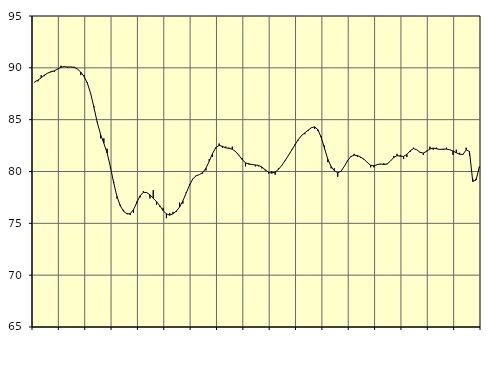
| Category | Piggar | Series 1 |
|---|---|---|
| nan | 88.6 | 88.65 |
| 87.0 | 88.7 | 88.81 |
| 87.0 | 89.3 | 89.04 |
| 87.0 | 89.2 | 89.31 |
| nan | 89.5 | 89.5 |
| 88.0 | 89.7 | 89.62 |
| 88.0 | 89.6 | 89.72 |
| 88.0 | 89.9 | 89.88 |
| nan | 90.2 | 90.06 |
| 89.0 | 90.1 | 90.12 |
| 89.0 | 90 | 90.08 |
| 89.0 | 90.1 | 90.08 |
| nan | 90.1 | 90.05 |
| 90.0 | 89.9 | 89.88 |
| 90.0 | 89.3 | 89.59 |
| 90.0 | 89.3 | 89.17 |
| nan | 88.6 | 88.52 |
| 91.0 | 87.5 | 87.53 |
| 91.0 | 86.3 | 86.18 |
| 91.0 | 84.8 | 84.74 |
| nan | 83.2 | 83.58 |
| 92.0 | 83.2 | 82.73 |
| 92.0 | 82.2 | 81.79 |
| 92.0 | 80.3 | 80.45 |
| nan | 79 | 78.89 |
| 93.0 | 77.4 | 77.58 |
| 93.0 | 76.8 | 76.69 |
| 93.0 | 76.3 | 76.17 |
| nan | 76 | 75.91 |
| 94.0 | 75.8 | 75.93 |
| 94.0 | 76 | 76.32 |
| 94.0 | 77.1 | 76.99 |
| nan | 77.5 | 77.65 |
| 95.0 | 78.1 | 77.99 |
| 95.0 | 78 | 77.97 |
| 95.0 | 77.4 | 77.75 |
| nan | 78.2 | 77.42 |
| 96.0 | 76.8 | 77.09 |
| 96.0 | 76.6 | 76.69 |
| 96.0 | 76.5 | 76.23 |
| nan | 75.5 | 75.91 |
| 97.0 | 76 | 75.79 |
| 97.0 | 76.1 | 75.92 |
| 97.0 | 76.1 | 76.18 |
| nan | 77 | 76.57 |
| 98.0 | 76.9 | 77.17 |
| 98.0 | 78 | 77.92 |
| 98.0 | 78.8 | 78.67 |
| nan | 79.3 | 79.28 |
| 99.0 | 79.6 | 79.58 |
| 99.0 | 79.7 | 79.7 |
| 99.0 | 79.8 | 79.89 |
| nan | 80.1 | 80.32 |
| 0.0 | 81.2 | 80.99 |
| 0.0 | 81.4 | 81.73 |
| 0.0 | 82.2 | 82.31 |
| nan | 82.7 | 82.52 |
| 1.0 | 82.3 | 82.43 |
| 1.0 | 82.4 | 82.28 |
| 1.0 | 82.3 | 82.23 |
| nan | 82.4 | 82.15 |
| 2.0 | 81.9 | 81.93 |
| 2.0 | 81.6 | 81.57 |
| 2.0 | 81.3 | 81.15 |
| nan | 80.5 | 80.84 |
| 3.0 | 80.8 | 80.71 |
| 3.0 | 80.7 | 80.68 |
| 3.0 | 80.5 | 80.63 |
| nan | 80.5 | 80.58 |
| 4.0 | 80.3 | 80.43 |
| 4.0 | 80.1 | 80.17 |
| 4.0 | 79.8 | 79.93 |
| nan | 80 | 79.84 |
| 5.0 | 79.7 | 79.95 |
| 5.0 | 80.3 | 80.2 |
| 5.0 | 80.6 | 80.58 |
| nan | 81 | 81.04 |
| 6.0 | 81.5 | 81.53 |
| 6.0 | 82.1 | 82.04 |
| 6.0 | 82.6 | 82.56 |
| nan | 83 | 83.07 |
| 7.0 | 83.5 | 83.46 |
| 7.0 | 83.6 | 83.72 |
| 7.0 | 83.9 | 83.98 |
| nan | 84.2 | 84.22 |
| 8.0 | 84.1 | 84.31 |
| 8.0 | 83.9 | 84.03 |
| 8.0 | 83.4 | 83.28 |
| nan | 82.5 | 82.23 |
| 9.0 | 80.9 | 81.18 |
| 9.0 | 80.3 | 80.48 |
| 9.0 | 80.3 | 80.07 |
| nan | 79.5 | 79.88 |
| 10.0 | 80 | 80.02 |
| 10.0 | 80.5 | 80.49 |
| 10.0 | 81 | 81.05 |
| nan | 81.5 | 81.44 |
| 11.0 | 81.7 | 81.58 |
| 11.0 | 81.4 | 81.53 |
| 11.0 | 81.3 | 81.38 |
| nan | 81.2 | 81.18 |
| 12.0 | 80.9 | 80.86 |
| 12.0 | 80.4 | 80.6 |
| 12.0 | 80.4 | 80.55 |
| nan | 80.7 | 80.66 |
| 13.0 | 80.7 | 80.73 |
| 13.0 | 80.8 | 80.67 |
| 13.0 | 80.7 | 80.73 |
| nan | 81 | 81 |
| 14.0 | 81.5 | 81.35 |
| 14.0 | 81.7 | 81.53 |
| 14.0 | 81.6 | 81.48 |
| nan | 81.2 | 81.46 |
| 15.0 | 81.4 | 81.65 |
| 15.0 | 81.9 | 82 |
| 15.0 | 82.3 | 82.21 |
| nan | 82.1 | 82.1 |
| 16.0 | 81.8 | 81.85 |
| 16.0 | 81.6 | 81.78 |
| 16.0 | 82 | 81.95 |
| nan | 82.4 | 82.17 |
| 17.0 | 82.1 | 82.26 |
| 17.0 | 82.3 | 82.19 |
| 17.0 | 82.1 | 82.13 |
| nan | 82.1 | 82.16 |
| 18.0 | 82.3 | 82.16 |
| 18.0 | 82.1 | 82.1 |
| 18.0 | 81.6 | 81.98 |
| nan | 82.1 | 81.81 |
| 19.0 | 81.8 | 81.67 |
| 19.0 | 81.6 | 81.64 |
| 19.0 | 82.3 | 82.09 |
| nan | 81.5 | 81.93 |
| 20.0 | 79.3 | 79.04 |
| 20.0 | 79.3 | 79.18 |
| 20.0 | 80.4 | 80.46 |